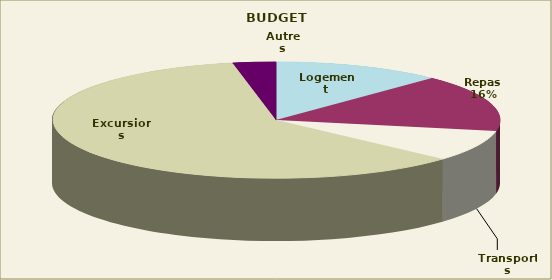
| Category | Series 0 |
|---|---|
| Logement | 74.389 |
| Repas | 96.511 |
| Transports | 52.961 |
| Excursions | 367.615 |
| Autres | 18.958 |